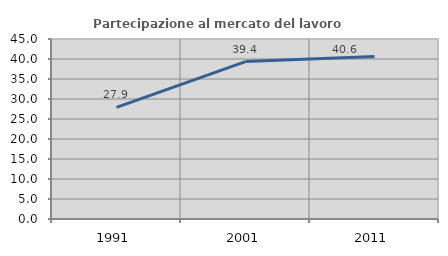
| Category | Partecipazione al mercato del lavoro  femminile |
|---|---|
| 1991.0 | 27.907 |
| 2001.0 | 39.352 |
| 2011.0 | 40.625 |